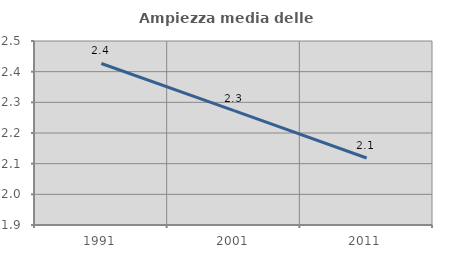
| Category | Ampiezza media delle famiglie |
|---|---|
| 1991.0 | 2.427 |
| 2001.0 | 2.273 |
| 2011.0 | 2.118 |